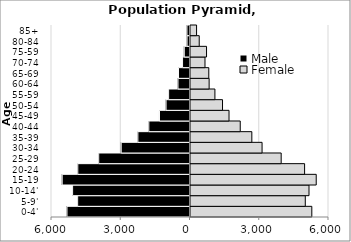
| Category | Male | Female |
|---|---|---|
| 0-4' | -5329.85 | 5255.89 |
| 5-9' | -4866.97 | 4972.72 |
| 10-14' | -5085.79 | 5133.65 |
| 15-19 | -5537.56 | 5446.57 |
| 20-24 | -4861.25 | 4943.13 |
| 25-29 | -3954.87 | 3928.69 |
| 30-34 | -2980.71 | 3100.47 |
| 35-39 | -2258.24 | 2657.24 |
| 40-44 | -1784.28 | 2155.11 |
| 45-49 | -1322.24 | 1669.22 |
| 50-54 | -1037.51 | 1387.27 |
| 55-59 | -926.52 | 1057.4 |
| 60-64 | -521 | 807.33 |
| 65-69 | -497.14 | 792.04 |
| 70-74 | -322.78 | 627.82 |
| 75-59 | -249.03 | 694.54 |
| 80-84 | -127.7 | 378.12 |
| 85+ | -132.55 | 262.77 |